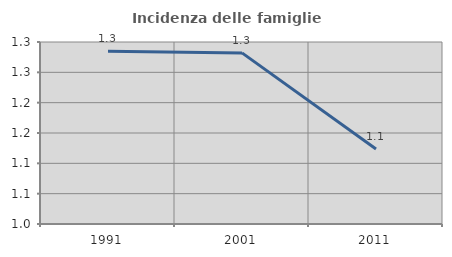
| Category | Incidenza delle famiglie numerose |
|---|---|
| 1991.0 | 1.285 |
| 2001.0 | 1.282 |
| 2011.0 | 1.124 |